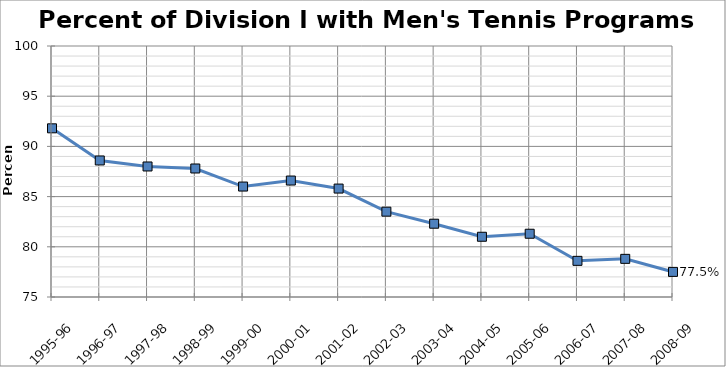
| Category | Men's |
|---|---|
| 1995-96 | 91.8 |
| 1996-97 | 88.6 |
| 1997-98 | 88 |
| 1998-99 | 87.8 |
| 1999-00 | 86 |
| 2000-01 | 86.6 |
| 2001-02 | 85.8 |
| 2002-03 | 83.5 |
| 2003-04 | 82.3 |
| 2004-05 | 81 |
| 2005-06 | 81.3 |
| 2006-07 | 78.6 |
| 2007-08 | 78.8 |
| 2008-09 | 77.5 |